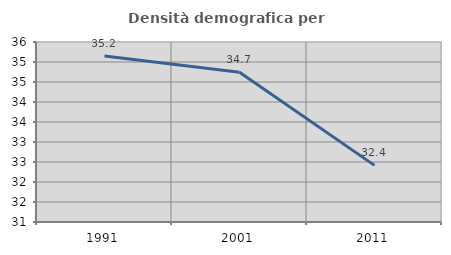
| Category | Densità demografica |
|---|---|
| 1991.0 | 35.151 |
| 2001.0 | 34.742 |
| 2011.0 | 32.416 |